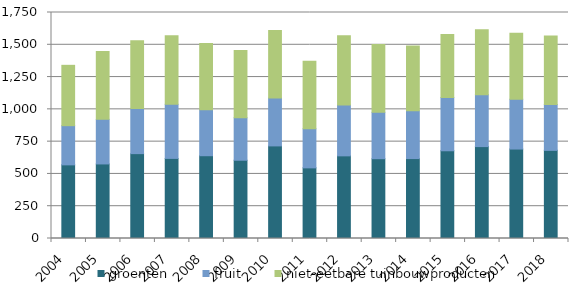
| Category | groenten | fruit | niet-eetbare tuinbouwproducten |
|---|---|---|---|
| 2004.0 | 570.192 | 303.456 | 467.273 |
| 2005.0 | 577.371 | 345.063 | 526.477 |
| 2006.0 | 657.187 | 350.404 | 524.412 |
| 2007.0 | 620.303 | 418.819 | 531.548 |
| 2008.0 | 641 | 356.69 | 512 |
| 2009.0 | 606 | 329 | 520 |
| 2010.0 | 717 | 370 | 524 |
| 2011.0 | 547 | 303 | 523 |
| 2012.0 | 640 | 393 | 536 |
| 2013.0 | 618 | 359 | 525 |
| 2014.0 | 619 | 370 | 502 |
| 2015.0 | 679.318 | 411.861 | 488.989 |
| 2016.0 | 711.7 | 401.4 | 503 |
| 2017.0 | 692.7 | 385.6 | 510.4 |
| 2018.0 | 682.4 | 355.1 | 529.7 |